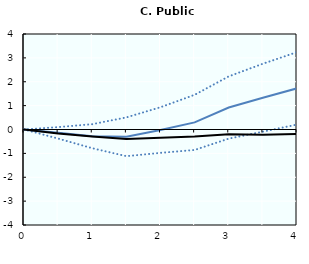
| Category | Effect during bust | confidence lower | confidence upper | Average effect |
|---|---|---|---|---|
| 0.0 | 0 | 0 | 0 | 0 |
| nan | -0.14 | -0.38 | 0.1 | -0.163 |
| 1.0 | -0.281 | -0.784 | 0.223 | -0.291 |
| nan | -0.305 | -1.117 | 0.507 | -0.396 |
| 2.0 | -0.023 | -0.978 | 0.933 | -0.348 |
| nan | 0.298 | -0.857 | 1.452 | -0.293 |
| 3.0 | 0.921 | -0.382 | 2.225 | -0.202 |
| nan | 1.332 | -0.09 | 2.755 | -0.22 |
| 4.0 | 1.724 | 0.207 | 3.24 | -0.193 |